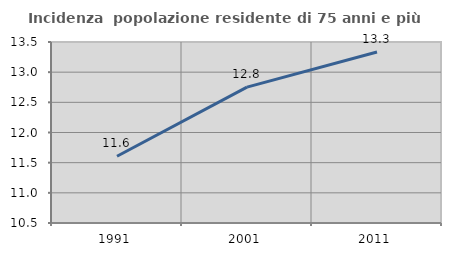
| Category | Incidenza  popolazione residente di 75 anni e più |
|---|---|
| 1991.0 | 11.607 |
| 2001.0 | 12.751 |
| 2011.0 | 13.333 |